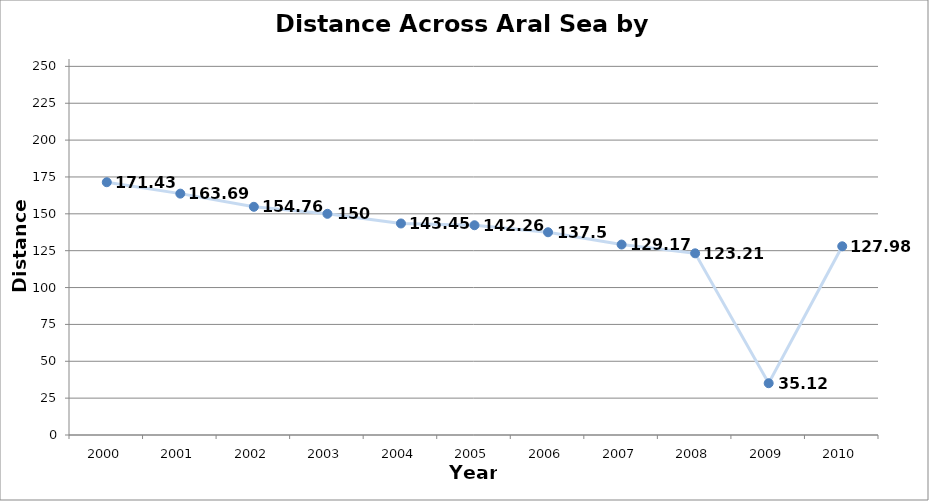
| Category | Distance Across Sea in Km |
|---|---|
| 2000 | 171.43 |
| 2001 | 163.69 |
| 2002 | 154.76 |
| 2003 | 150 |
| 2004 | 143.45 |
| 2005 | 142.26 |
| 2006 | 137.5 |
| 2007 | 129.17 |
| 2008 | 123.21 |
| 2009 | 35.12 |
| 2010 | 127.98 |